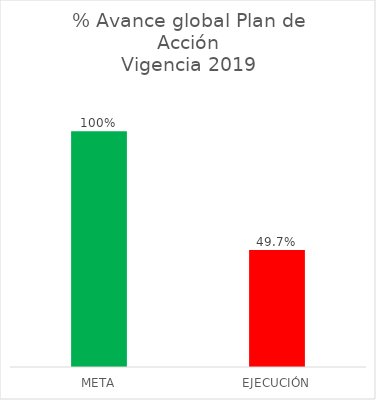
| Category | % Avance global Plan de Acción
Vigencia 2019 |
|---|---|
| META | 1 |
| EJECUCIÓN | 0.497 |